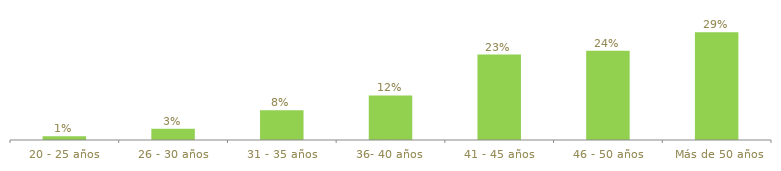
| Category | Series 0 |
|---|---|
| 20 - 25 años | 0.01 |
| 26 - 30 años | 0.03 |
| 31 - 35 años | 0.08 |
| 36- 40 años | 0.12 |
| 41 - 45 años | 0.23 |
| 46 - 50 años | 0.24 |
|  Más de 50 años | 0.29 |